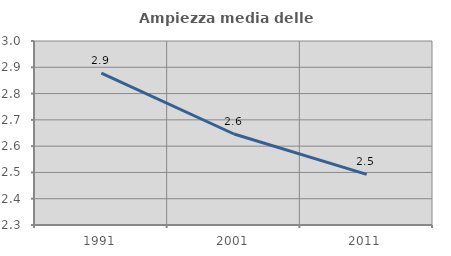
| Category | Ampiezza media delle famiglie |
|---|---|
| 1991.0 | 2.878 |
| 2001.0 | 2.646 |
| 2011.0 | 2.493 |